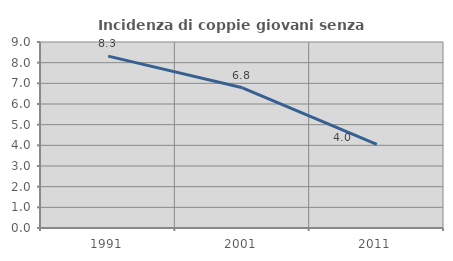
| Category | Incidenza di coppie giovani senza figli |
|---|---|
| 1991.0 | 8.316 |
| 2001.0 | 6.783 |
| 2011.0 | 4.042 |